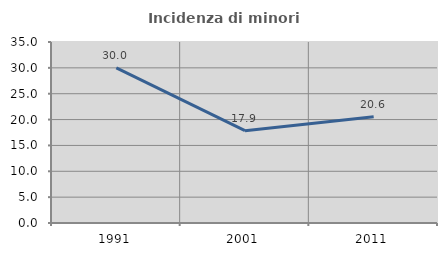
| Category | Incidenza di minori stranieri |
|---|---|
| 1991.0 | 30 |
| 2001.0 | 17.857 |
| 2011.0 | 20.561 |